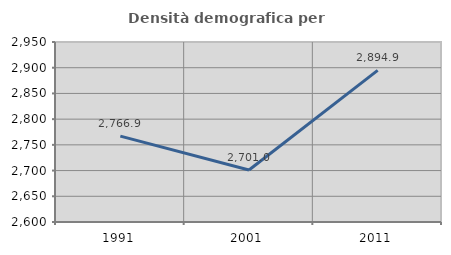
| Category | Densità demografica |
|---|---|
| 1991.0 | 2766.919 |
| 2001.0 | 2701.04 |
| 2011.0 | 2894.919 |